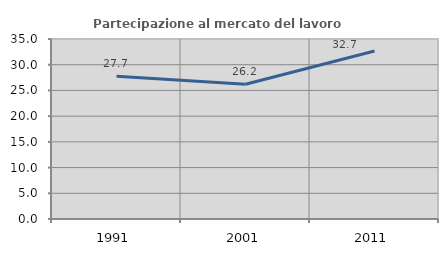
| Category | Partecipazione al mercato del lavoro  femminile |
|---|---|
| 1991.0 | 27.746 |
| 2001.0 | 26.19 |
| 2011.0 | 32.653 |